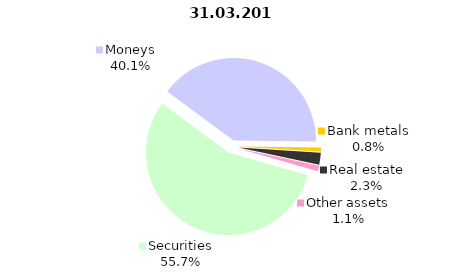
| Category | Total |
|---|---|
| Securities | 677.678 |
| Moneys | 487.385 |
| Bank metals | 9.746 |
| Real estate | 28.218 |
| Other assets | 13.524 |